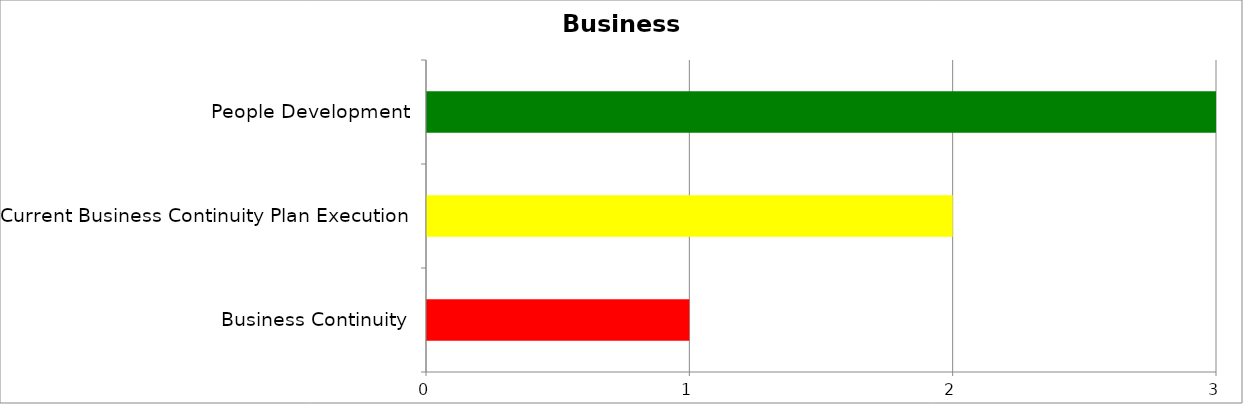
| Category | Series 0 | Series 1 | Series 2 |
|---|---|---|---|
| Business Continuity | 0 | 0 | 1 |
| Current Business Continuity Plan Execution | 0 | 2 | 0 |
| People Development | 3 | 0 | 0 |